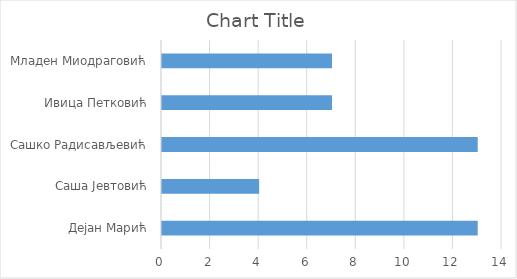
| Category | Series 0 |
|---|---|
| Дејан Марић | 13 |
| Саша Јевтовић | 4 |
| Сашко Радисављевић | 13 |
| Ивица Петковић | 7 |
| Младен Миодраговић | 7 |